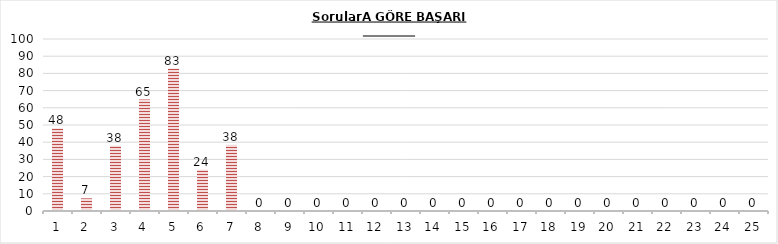
| Category | Series 0 |
|---|---|
| 0 | 48 |
| 1 | 7.36 |
| 2 | 38 |
| 3 | 64.8 |
| 4 | 82.8 |
| 5 | 24 |
| 6 | 38.4 |
| 7 | 0 |
| 8 | 0 |
| 9 | 0 |
| 10 | 0 |
| 11 | 0 |
| 12 | 0 |
| 13 | 0 |
| 14 | 0 |
| 15 | 0 |
| 16 | 0 |
| 17 | 0 |
| 18 | 0 |
| 19 | 0 |
| 20 | 0 |
| 21 | 0 |
| 22 | 0 |
| 23 | 0 |
| 24 | 0 |